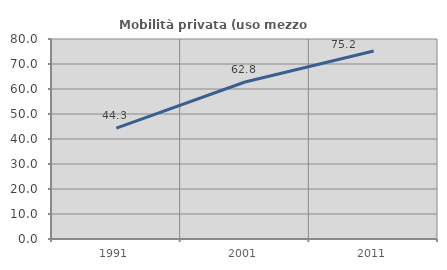
| Category | Mobilità privata (uso mezzo privato) |
|---|---|
| 1991.0 | 44.318 |
| 2001.0 | 62.793 |
| 2011.0 | 75.177 |